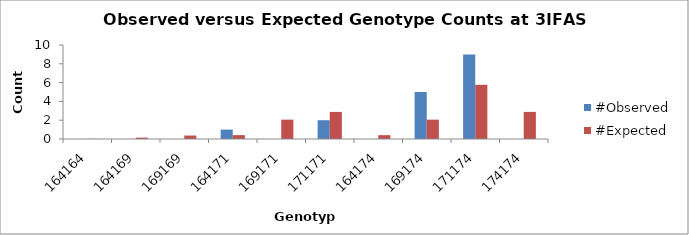
| Category | #Observed | #Expected |
|---|---|---|
| 164164.0 | 0 | 0.015 |
| 164169.0 | 0 | 0.147 |
| 169169.0 | 0 | 0.368 |
| 164171.0 | 1 | 0.412 |
| 169171.0 | 0 | 2.059 |
| 171171.0 | 2 | 2.882 |
| 164174.0 | 0 | 0.412 |
| 169174.0 | 5 | 2.059 |
| 171174.0 | 9 | 5.765 |
| 174174.0 | 0 | 2.882 |